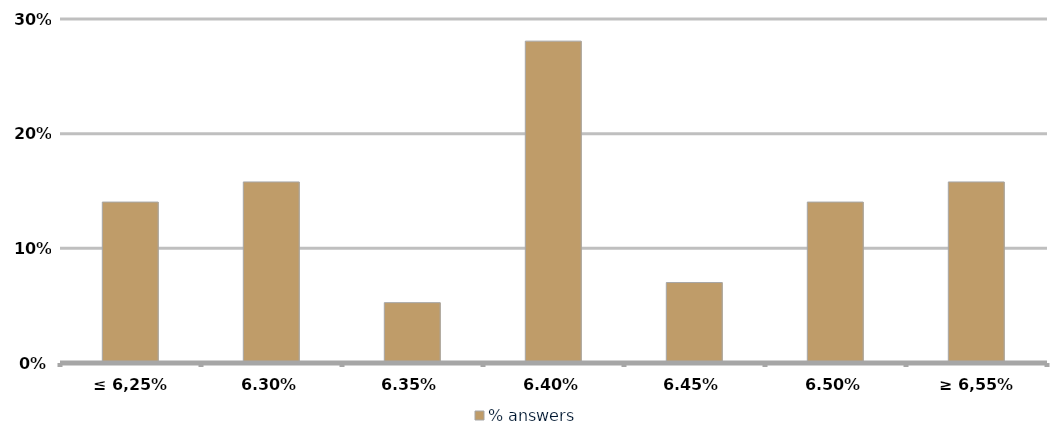
| Category | % answers |
|---|---|
| ≤ 6,25% | 0.14 |
| 6,30% | 0.158 |
| 6,35% | 0.053 |
| 6,40% | 0.281 |
| 6,45% | 0.07 |
| 6,50% | 0.14 |
| ≥ 6,55% | 0.158 |